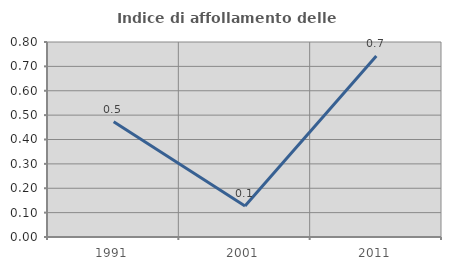
| Category | Indice di affollamento delle abitazioni  |
|---|---|
| 1991.0 | 0.472 |
| 2001.0 | 0.128 |
| 2011.0 | 0.742 |